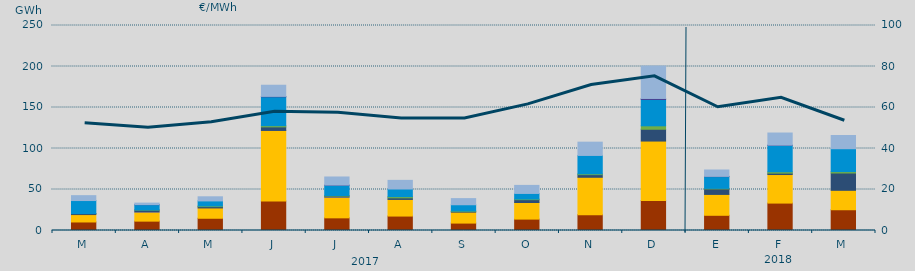
| Category | Carbón | Ciclo Combinado | Cogeneración | Consumo Bombeo | Eólica | Hidráulica | Nuclear | Turbinación bombeo |
|---|---|---|---|---|---|---|---|---|
| M | 10392.3 | 9024.8 | 0 | 1213 | 83.9 | 15815.6 | 0 | 5970.4 |
| A | 11417.3 | 11177.4 | 1 | 2298.7 | 146.3 | 6448.1 | 105 | 1824.9 |
| M | 14921.9 | 12578.5 | 0 | 1623.5 | 791 | 6148.7 | 0 | 5041.6 |
| J | 35897.1 | 86103.9 | 16 | 4321.9 | 1499 | 35181.7 | 537 | 13587.3 |
| J | 15424.3 | 25298.7 | 6 | 1196.5 | 694.8 | 12560.8 | 231 | 9853.3 |
| A | 17604.1 | 20278.5 | 0 | 1953.7 | 1479 | 9282.6 | 0 | 10537.6 |
| S | 9030.9 | 13355.9 | 0 | 972.7 | 456.9 | 7586.6 | 0 | 7497.3 |
| O | 13899.2 | 20227.3 | 0 | 3473.9 | 731.2 | 6859.3 | 0 | 9809.3 |
| N | 19298.3 | 45604 | 0 | 3226 | 983.4 | 22432 | 0 | 16186.5 |
| D | 36464.5 | 72616.8 | 0 | 14393.3 | 4195.1 | 32118.7 | 1236 | 39485.4 |
| E | 18538.8 | 25466.6 | 0 | 6696 | 686 | 14339.3 | 277 | 7767.7 |
| F | 33434.8 | 34817.7 | 0 | 1704 | 1654.6 | 32219.8 | 258 | 14790.9 |
| M | 25308.3 | 23702.3 | 0 | 21100.1 | 1712.3 | 27908.3 | 0 | 16090.2 |